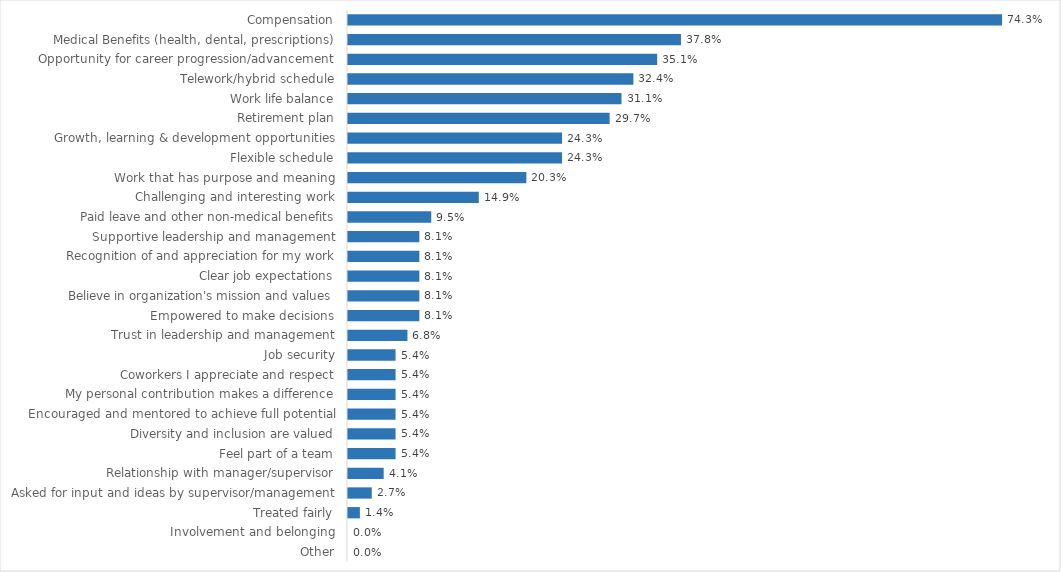
| Category | Commerce & Community Development |
|---|---|
| Compensation | 0.743 |
| Medical Benefits (health, dental, prescriptions) | 0.378 |
| Opportunity for career progression/advancement | 0.351 |
| Telework/hybrid schedule | 0.324 |
| Work life balance | 0.311 |
| Retirement plan | 0.297 |
| Growth, learning & development opportunities | 0.243 |
| Flexible schedule | 0.243 |
| Work that has purpose and meaning | 0.203 |
| Challenging and interesting work | 0.149 |
| Paid leave and other non-medical benefits | 0.095 |
| Supportive leadership and management | 0.081 |
| Recognition of and appreciation for my work | 0.081 |
| Clear job expectations | 0.081 |
| Believe in organization's mission and values | 0.081 |
| Empowered to make decisions | 0.081 |
| Trust in leadership and management | 0.068 |
| Job security | 0.054 |
| Coworkers I appreciate and respect | 0.054 |
| My personal contribution makes a difference | 0.054 |
| Encouraged and mentored to achieve full potential | 0.054 |
| Diversity and inclusion are valued | 0.054 |
| Feel part of a team | 0.054 |
| Relationship with manager/supervisor | 0.041 |
| Asked for input and ideas by supervisor/management | 0.027 |
| Treated fairly | 0.014 |
| Involvement and belonging | 0 |
| Other | 0 |